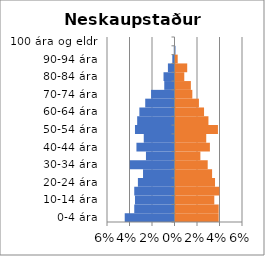
| Category | % karlar | %konur |
|---|---|---|
| 0-4 ára | -0.044 | 0.038 |
| 5-9 ára | -0.036 | 0.038 |
| 10-14 ára | -0.035 | 0.034 |
| 15-19 ára | -0.036 | 0.039 |
| 20-24 ára | -0.033 | 0.035 |
| 25-29 ára | -0.028 | 0.033 |
| 30-34 ára | -0.04 | 0.029 |
| 35-39 ára | -0.025 | 0.022 |
| 40-44 ára | -0.034 | 0.031 |
| 45-49 ára | -0.027 | 0.027 |
| 50-54 ára | -0.035 | 0.038 |
| 55-59 ára | -0.033 | 0.029 |
| 60-64 ára | -0.031 | 0.025 |
| 65-69 ára | -0.026 | 0.021 |
| 70-74 ára | -0.021 | 0.015 |
| 75-79 ára | -0.009 | 0.014 |
| 80-84 ára | -0.01 | 0.008 |
| 85-89 ára | -0.006 | 0.01 |
| 90-94 ára | -0.002 | 0.002 |
| 95-99 ára | -0.001 | 0 |
| 100 ára og eldri | 0 | 0 |